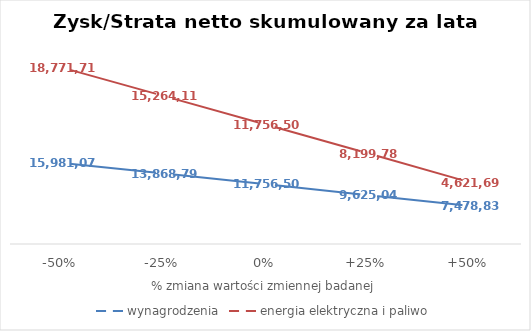
| Category | wynagrodzenia | energia elektryczna i paliwo |
|---|---|---|
| -50% | 15981077.965 | 18771711.803 |
| -25% | 13868792.798 | 15264109.717 |
| 0% | 11756507.632 | 11756508 |
| +25% | 9625047.553 | 8199786.065 |
| +50% | 7478831.147 | 4621698.667 |